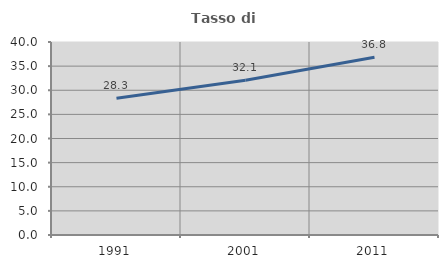
| Category | Tasso di occupazione   |
|---|---|
| 1991.0 | 28.327 |
| 2001.0 | 32.074 |
| 2011.0 | 36.822 |